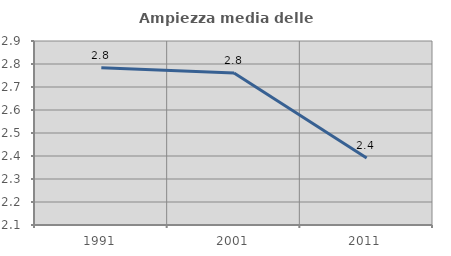
| Category | Ampiezza media delle famiglie |
|---|---|
| 1991.0 | 2.784 |
| 2001.0 | 2.761 |
| 2011.0 | 2.391 |